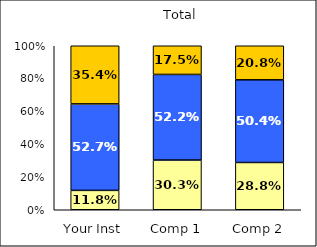
| Category | Low Academic Self-Concept | Average Academic Self-Concept | High Academic Self-Concept |
|---|---|---|---|
| Your Inst | 0.118 | 0.527 | 0.354 |
| Comp 1 | 0.303 | 0.522 | 0.175 |
| Comp 2 | 0.288 | 0.504 | 0.208 |